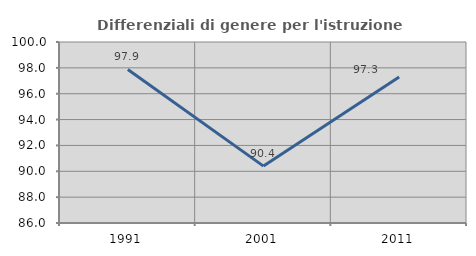
| Category | Differenziali di genere per l'istruzione superiore |
|---|---|
| 1991.0 | 97.874 |
| 2001.0 | 90.4 |
| 2011.0 | 97.293 |